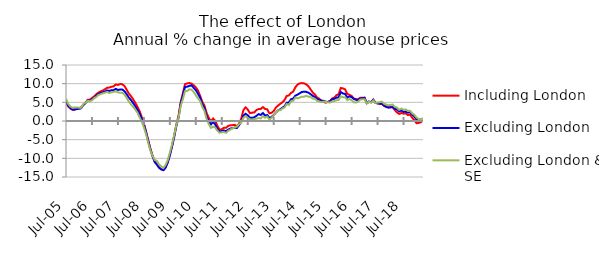
| Category | Including London | Excluding London | Excluding London & SE |
|---|---|---|---|
| 2005-07-01 | 4.985 | 5.285 | 5.958 |
| 2005-08-01 | 3.942 | 4.148 | 4.612 |
| 2005-09-01 | 3.341 | 3.501 | 3.879 |
| 2005-10-01 | 3.024 | 3.094 | 3.539 |
| 2005-11-01 | 3.025 | 3.077 | 3.658 |
| 2005-12-01 | 3.322 | 3.21 | 3.603 |
| 2006-01-01 | 3.425 | 3.273 | 3.573 |
| 2006-02-01 | 3.671 | 3.415 | 3.543 |
| 2006-03-01 | 4.341 | 4.268 | 4.537 |
| 2006-04-01 | 4.935 | 4.761 | 4.907 |
| 2006-05-01 | 5.674 | 5.506 | 5.421 |
| 2006-06-01 | 5.696 | 5.38 | 5.292 |
| 2006-07-01 | 6.145 | 5.816 | 5.555 |
| 2006-08-01 | 6.611 | 6.227 | 6.099 |
| 2006-09-01 | 7.182 | 6.748 | 6.46 |
| 2006-10-01 | 7.614 | 7.259 | 6.976 |
| 2006-11-01 | 7.936 | 7.496 | 7.178 |
| 2006-12-01 | 8.161 | 7.69 | 7.429 |
| 2007-01-01 | 8.511 | 7.868 | 7.579 |
| 2007-02-01 | 8.903 | 8.173 | 7.775 |
| 2007-03-01 | 8.951 | 8.042 | 7.493 |
| 2007-04-01 | 9.183 | 8.253 | 7.683 |
| 2007-05-01 | 9.276 | 8.26 | 7.795 |
| 2007-06-01 | 9.793 | 8.619 | 7.94 |
| 2007-07-01 | 9.657 | 8.303 | 7.666 |
| 2007-08-01 | 9.904 | 8.435 | 7.557 |
| 2007-09-01 | 9.848 | 8.43 | 7.59 |
| 2007-10-01 | 9.4 | 7.992 | 7.065 |
| 2007-11-01 | 8.429 | 7.205 | 6.216 |
| 2007-12-01 | 7.399 | 6.295 | 5.257 |
| 2008-01-01 | 6.692 | 5.641 | 4.468 |
| 2008-02-01 | 5.846 | 4.829 | 3.835 |
| 2008-03-01 | 4.892 | 3.992 | 3.095 |
| 2008-04-01 | 3.832 | 3.006 | 2.25 |
| 2008-05-01 | 2.671 | 1.945 | 1 |
| 2008-06-01 | 1.093 | 0.56 | -0.149 |
| 2008-07-01 | -0.669 | -0.999 | -1.68 |
| 2008-08-01 | -2.797 | -3.023 | -3.517 |
| 2008-09-01 | -5.166 | -5.325 | -5.862 |
| 2008-10-01 | -7.43 | -7.61 | -7.915 |
| 2008-11-01 | -9.307 | -9.425 | -9.312 |
| 2008-12-01 | -10.774 | -10.987 | -10.43 |
| 2009-01-01 | -11.579 | -11.649 | -10.704 |
| 2009-02-01 | -12.48 | -12.489 | -11.651 |
| 2009-03-01 | -12.965 | -12.948 | -12.105 |
| 2009-04-01 | -13.168 | -13.142 | -12.6 |
| 2009-05-01 | -12.416 | -12.532 | -11.801 |
| 2009-06-01 | -11.052 | -11.15 | -10.53 |
| 2009-07-01 | -9.03 | -9.21 | -8.474 |
| 2009-08-01 | -6.728 | -6.864 | -6.24 |
| 2009-09-01 | -3.894 | -4.294 | -3.737 |
| 2009-10-01 | -0.973 | -1.356 | -1.099 |
| 2009-11-01 | 1.393 | 0.824 | 0.793 |
| 2009-12-01 | 5.017 | 4.628 | 4.013 |
| 2010-01-01 | 7.384 | 6.795 | 5.826 |
| 2010-02-01 | 9.855 | 9.102 | 7.992 |
| 2010-03-01 | 10.07 | 9.191 | 8.012 |
| 2010-04-01 | 10.175 | 9.397 | 8.489 |
| 2010-05-01 | 10.021 | 9.556 | 8.394 |
| 2010-06-01 | 9.57 | 8.896 | 7.769 |
| 2010-07-01 | 9.01 | 8.261 | 6.872 |
| 2010-08-01 | 8.161 | 7.3 | 6.091 |
| 2010-09-01 | 6.737 | 6.228 | 5.324 |
| 2010-10-01 | 5.097 | 4.504 | 3.767 |
| 2010-11-01 | 4.119 | 3.44 | 2.672 |
| 2010-12-01 | 2.107 | 1.205 | 0.55 |
| 2011-01-01 | 0.832 | -0.007 | -0.817 |
| 2011-02-01 | -0.064 | -0.916 | -1.859 |
| 2011-03-01 | 0.664 | -0.28 | -1.49 |
| 2011-04-01 | 0.04 | -0.934 | -1.774 |
| 2011-05-01 | -1.33 | -2.127 | -2.627 |
| 2011-06-01 | -2.373 | -2.831 | -3.144 |
| 2011-07-01 | -2.175 | -2.71 | -3.01 |
| 2011-08-01 | -1.82 | -2.516 | -2.938 |
| 2011-09-01 | -1.818 | -2.744 | -3.18 |
| 2011-10-01 | -1.307 | -2.289 | -2.634 |
| 2011-11-01 | -1.143 | -2.026 | -2.293 |
| 2011-12-01 | -1.106 | -1.913 | -2.005 |
| 2012-01-01 | -1.024 | -1.746 | -1.671 |
| 2012-02-01 | -1.426 | -1.884 | -1.522 |
| 2012-03-01 | -0.681 | -1.106 | -0.818 |
| 2012-04-01 | 0.648 | -0.153 | -0.4 |
| 2012-05-01 | 2.927 | 1.429 | 0.849 |
| 2012-06-01 | 3.668 | 1.93 | 1.317 |
| 2012-07-01 | 3.062 | 1.519 | 0.896 |
| 2012-08-01 | 2.114 | 0.898 | 0.451 |
| 2012-09-01 | 2.228 | 0.844 | 0.317 |
| 2012-10-01 | 2.288 | 0.995 | 0.512 |
| 2012-11-01 | 2.919 | 1.375 | 0.638 |
| 2012-12-01 | 3.206 | 1.844 | 0.799 |
| 2013-01-01 | 3.214 | 1.629 | 0.672 |
| 2013-02-01 | 3.732 | 2.132 | 1.317 |
| 2013-03-01 | 3.237 | 1.465 | 0.874 |
| 2013-04-01 | 3.126 | 1.601 | 1.197 |
| 2013-05-01 | 2.056 | 0.826 | 0.387 |
| 2013-06-01 | 2.192 | 1.082 | 0.837 |
| 2013-07-01 | 2.68 | 1.598 | 1.466 |
| 2013-08-01 | 3.576 | 2.238 | 2.209 |
| 2013-09-01 | 4.132 | 2.856 | 2.896 |
| 2013-10-01 | 4.582 | 3.11 | 2.859 |
| 2013-11-01 | 4.995 | 3.562 | 3.359 |
| 2013-12-01 | 5.615 | 3.935 | 3.597 |
| 2014-01-01 | 6.711 | 4.89 | 4.53 |
| 2014-02-01 | 6.851 | 4.941 | 4.299 |
| 2014-03-01 | 7.542 | 5.812 | 5.315 |
| 2014-04-01 | 7.849 | 5.997 | 5.41 |
| 2014-05-01 | 9.019 | 6.795 | 6.287 |
| 2014-06-01 | 9.76 | 7.049 | 6.056 |
| 2014-07-01 | 10.057 | 7.413 | 6.278 |
| 2014-08-01 | 10.16 | 7.769 | 6.496 |
| 2014-09-01 | 10.09 | 7.834 | 6.504 |
| 2014-10-01 | 9.812 | 7.805 | 6.748 |
| 2014-11-01 | 9.335 | 7.601 | 6.516 |
| 2014-12-01 | 8.503 | 7.208 | 6.49 |
| 2015-01-01 | 7.651 | 6.75 | 6 |
| 2015-02-01 | 7.124 | 6.448 | 5.968 |
| 2015-03-01 | 6.321 | 5.929 | 5.435 |
| 2015-04-01 | 5.99 | 5.687 | 5.261 |
| 2015-05-01 | 5.409 | 5.478 | 5.063 |
| 2015-06-01 | 5.131 | 5.413 | 5.195 |
| 2015-07-01 | 4.913 | 5.172 | 5.091 |
| 2015-08-01 | 5.133 | 5.094 | 5.012 |
| 2015-09-01 | 5.322 | 5.273 | 4.949 |
| 2015-10-01 | 6.036 | 5.817 | 5.224 |
| 2015-11-01 | 6.255 | 5.933 | 5.346 |
| 2015-12-01 | 6.922 | 6.268 | 5.57 |
| 2016-01-01 | 7.158 | 6.346 | 5.646 |
| 2016-02-01 | 8.835 | 7.743 | 6.625 |
| 2016-03-01 | 8.737 | 7.362 | 6.354 |
| 2016-04-01 | 8.47 | 7.276 | 6.353 |
| 2016-05-01 | 7.262 | 6.277 | 5.616 |
| 2016-06-01 | 7.03 | 6.586 | 5.858 |
| 2016-07-01 | 6.71 | 6.388 | 5.574 |
| 2016-08-01 | 6.003 | 5.961 | 5.031 |
| 2016-09-01 | 5.878 | 5.678 | 4.945 |
| 2016-10-01 | 5.799 | 5.619 | 5.192 |
| 2016-11-01 | 6.242 | 5.99 | 5.735 |
| 2016-12-01 | 6.219 | 6.098 | 5.821 |
| 2017-01-01 | 6.22 | 6.214 | 5.843 |
| 2017-02-01 | 4.728 | 4.847 | 4.72 |
| 2017-03-01 | 5.107 | 5.232 | 5.154 |
| 2017-04-01 | 5.071 | 5.011 | 4.911 |
| 2017-05-01 | 5.741 | 5.651 | 5.507 |
| 2017-06-01 | 4.958 | 4.829 | 4.841 |
| 2017-07-01 | 4.734 | 4.732 | 4.939 |
| 2017-08-01 | 4.574 | 4.699 | 5.042 |
| 2017-09-01 | 4.575 | 4.693 | 5.183 |
| 2017-10-01 | 4.079 | 4.099 | 4.607 |
| 2017-11-01 | 3.857 | 3.793 | 4.409 |
| 2017-12-01 | 3.785 | 3.569 | 4.182 |
| 2018-01-01 | 3.812 | 3.637 | 4.308 |
| 2018-02-01 | 3.68 | 3.726 | 4.396 |
| 2018-03-01 | 2.895 | 3.255 | 3.796 |
| 2018-04-01 | 2.304 | 3.126 | 3.582 |
| 2018-05-01 | 1.882 | 2.567 | 2.997 |
| 2018-06-01 | 2.153 | 2.825 | 3.315 |
| 2018-07-01 | 1.955 | 2.426 | 2.991 |
| 2018-08-01 | 2.059 | 2.529 | 3.098 |
| 2018-09-01 | 1.593 | 2.25 | 2.709 |
| 2018-10-01 | 1.747 | 2.376 | 2.742 |
| 2018-11-01 | 0.893 | 1.761 | 2.055 |
| 2018-12-01 | 0.223 | 1.198 | 1.656 |
| 2019-01-01 | -0.585 | 0.408 | 0.924 |
| 2019-02-01 | -0.533 | 0.001 | 0.549 |
| 2019-03-01 | -0.328 | -0.094 | 0.505 |
| 2019-04-01 | 0.229 | 0.056 | 0.738 |